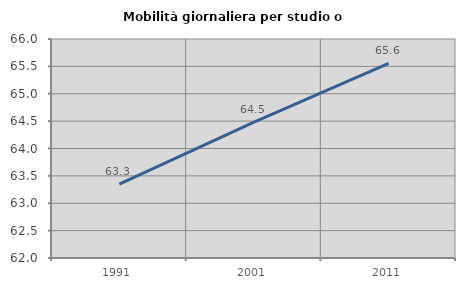
| Category | Mobilità giornaliera per studio o lavoro |
|---|---|
| 1991.0 | 63.35 |
| 2001.0 | 64.483 |
| 2011.0 | 65.556 |